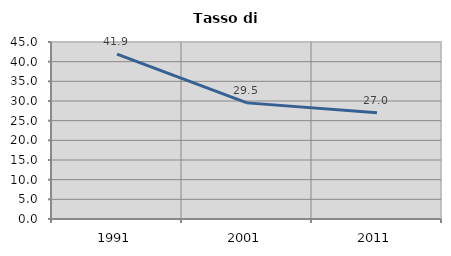
| Category | Tasso di disoccupazione   |
|---|---|
| 1991.0 | 41.905 |
| 2001.0 | 29.524 |
| 2011.0 | 27.042 |